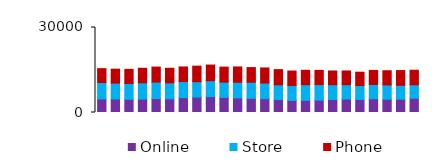
| Category | Online | Store | Phone |
|---|---|---|---|
| 0 | 4774 | 5816 | 4884 |
| 1 | 4763 | 5609 | 4927 |
| 2 | 4664 | 5561 | 5001 |
| 3 | 4734 | 5733 | 5144 |
| 4 | 4907 | 5822 | 5305 |
| 5 | 4803 | 5676 | 5135 |
| 6 | 5236 | 5687 | 5151 |
| 7 | 5449 | 5412 | 5500 |
| 8 | 5619 | 5600 | 5526 |
| 9 | 5340 | 5372 | 5303 |
| 10 | 5162 | 5511 | 5403 |
| 11 | 5004 | 5674 | 5178 |
| 12 | 4896 | 5503 | 5327 |
| 13 | 4551 | 5213 | 5369 |
| 14 | 4273 | 5264 | 5097 |
| 15 | 4295 | 5508 | 5090 |
| 16 | 4373 | 5480 | 5002 |
| 17 | 4581 | 5227 | 4847 |
| 18 | 4754 | 5061 | 4847 |
| 19 | 4588 | 4930 | 4707 |
| 20 | 4857 | 5035 | 4956 |
| 21 | 4676 | 5057 | 5002 |
| 22 | 4680 | 4905 | 5213 |
| 23 | 5010 | 4770 | 5135 |